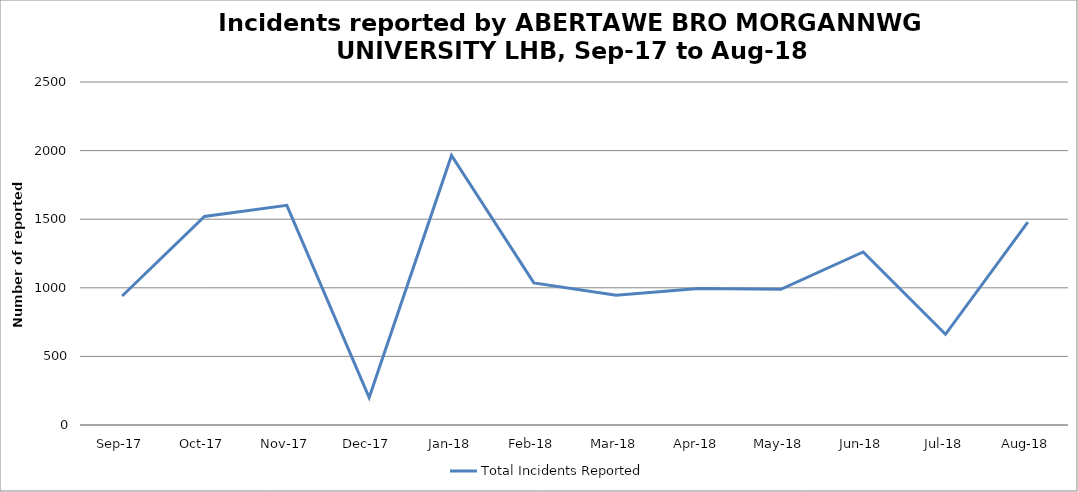
| Category | Total Incidents Reported |
|---|---|
| Sep-17 | 940 |
| Oct-17 | 1520 |
| Nov-17 | 1601 |
| Dec-17 | 200 |
| Jan-18 | 1965 |
| Feb-18 | 1036 |
| Mar-18 | 945 |
| Apr-18 | 994 |
| May-18 | 989 |
| Jun-18 | 1261 |
| Jul-18 | 661 |
| Aug-18 | 1479 |